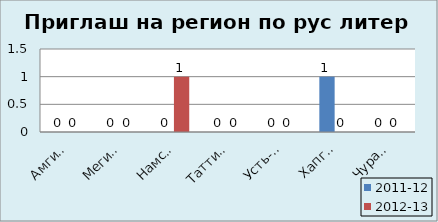
| Category | 2011-12 | 2012-13 |
|---|---|---|
| Амгинский | 0 | 0 |
| Мегино-Кангаласс | 0 | 0 |
| Намский | 0 | 1 |
| Таттинский | 0 | 0 |
| Усть-Алданский | 0 | 0 |
| Хапгаласский | 1 | 0 |
| Чурапчинский | 0 | 0 |